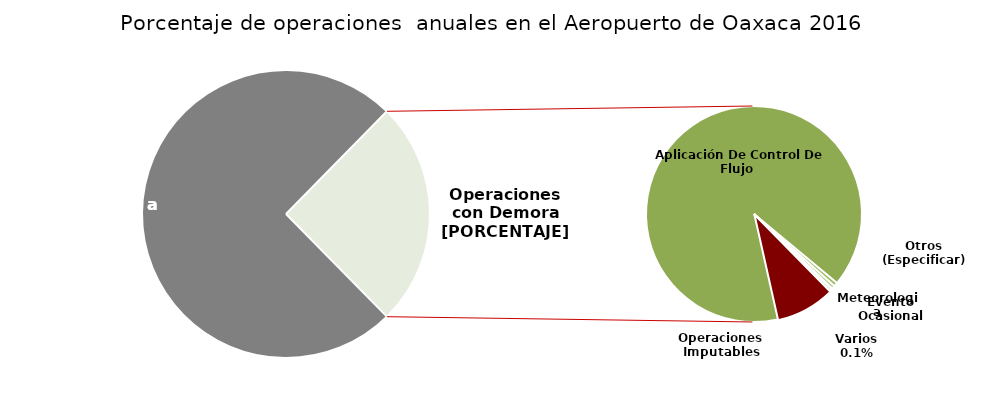
| Category | Series 0 |
|---|---|
| Operaciones a Tiempo | 3507 |
| Operaciones Imputables | 105 |
| Aplicación De Control De Flujo  | 1062 |
| Otros (Especificar) | 7 |
| Meteorologia | 6 |
| Evento Ocasional | 1 |
| Varios | 5 |